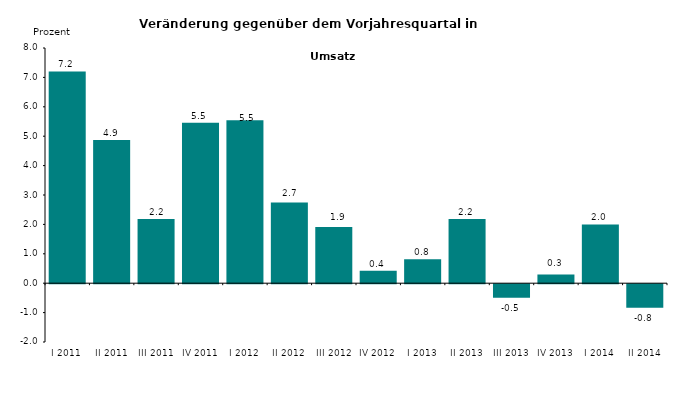
| Category | Series 0 |
|---|---|
| I 2011 | 7.201 |
| II 2011 | 4.867 |
| III 2011 | 2.186 |
| IV 2011 | 5.454 |
| I 2012 | 5.54 |
| II 2012 | 2.745 |
| III 2012 | 1.908 |
| IV 2012 | 0.427 |
| I 2013 | 0.81 |
| II 2013 | 2.181 |
| III 2013 | -0.465 |
| IV 2013 | 0.3 |
| I 2014 | 2 |
| II 2014 | -0.8 |